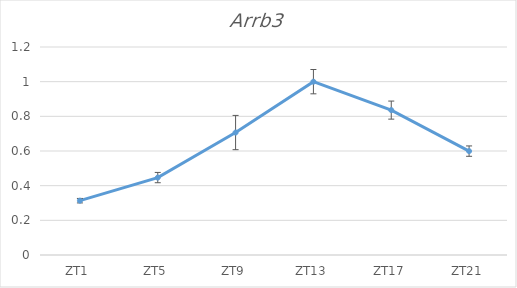
| Category | Series 0 |
|---|---|
| ZT1 | 0.313 |
| ZT5 | 0.447 |
| ZT9 | 0.706 |
| ZT13 | 1 |
| ZT17 | 0.836 |
| ZT21 | 0.599 |